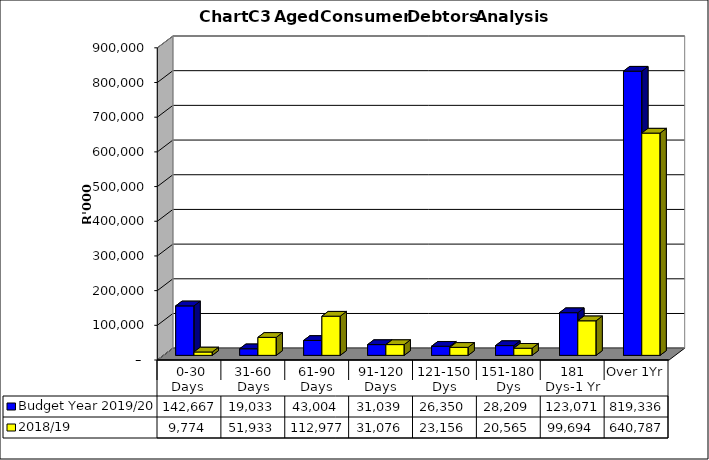
| Category | Budget Year 2019/20 | 2018/19 |
|---|---|---|
|  0-30 Days  | 142667460 | 9774314.69 |
| 31-60 Days | 19033220 | 51932577.53 |
| 61-90 Days | 43004421 | 112976705.56 |
| 91-120 Days | 31038730 | 31075597.17 |
| 121-150 Dys | 26349847 | 23156396.69 |
| 151-180 Dys | 28208855 | 20564553.58 |
| 181 Dys-1 Yr | 123071133 | 99693556.99 |
| Over 1Yr | 819335746 | 640786620.23 |